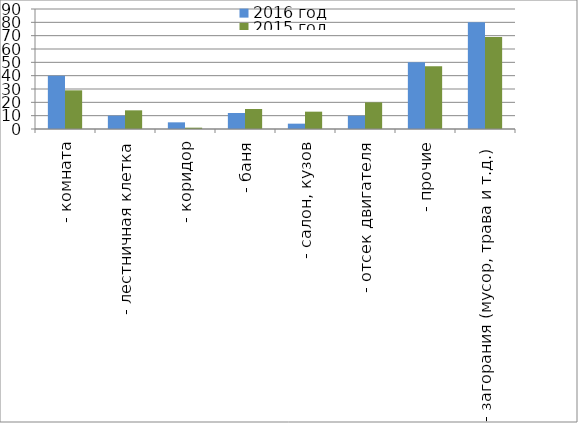
| Category | 2016 год | 2015 год |
|---|---|---|
|  - комната | 40 | 29 |
|  - лестничная клетка | 10 | 14 |
|  - коридор | 5 | 1 |
|  - баня | 12 | 15 |
|  - салон, кузов | 4 | 13 |
|  - отсек двигателя | 10 | 20 |
| - прочие | 50 | 47 |
| - загорания (мусор, трава и т.д.)  | 80 | 69 |